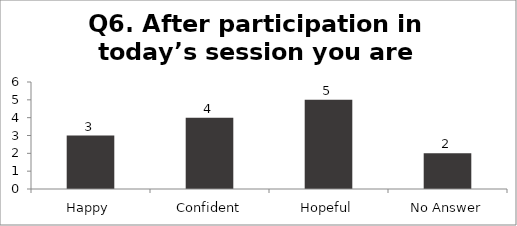
| Category | Q6. After participation in today’s session you are feeling? |
|---|---|
| Happy | 3 |
| Confident | 4 |
| Hopeful | 5 |
| No Answer | 2 |